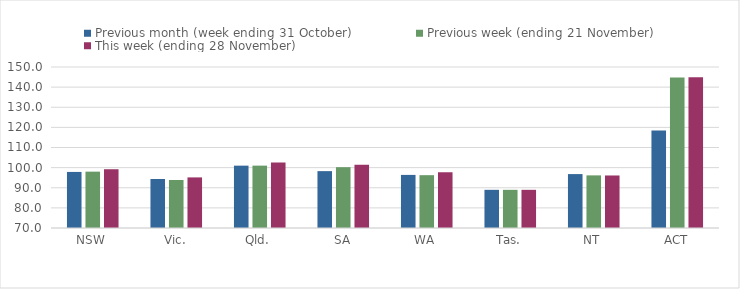
| Category | Previous month (week ending 31 October) | Previous week (ending 21 November) | This week (ending 28 November) |
|---|---|---|---|
| NSW | 97.86 | 98 | 99.2 |
| Vic. | 94.36 | 93.85 | 95.14 |
| Qld. | 100.98 | 100.99 | 102.53 |
| SA | 98.26 | 100.22 | 101.43 |
| WA | 96.38 | 96.25 | 97.7 |
| Tas. | 88.97 | 88.97 | 88.97 |
| NT | 96.79 | 96.15 | 96.1 |
| ACT | 118.42 | 144.74 | 144.95 |